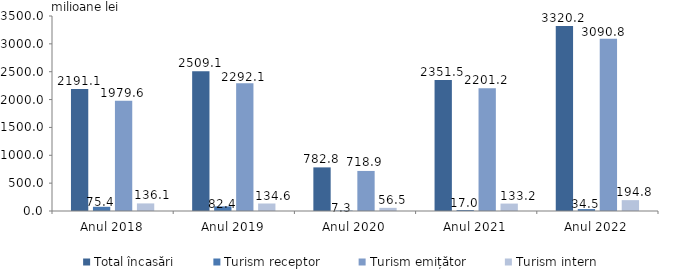
| Category | Total încasări | Turism receptor | Turism emițător | Turism intern |
|---|---|---|---|---|
| Anul 2018 | 2191.1 | 75.4 | 1979.6 | 136.1 |
| Anul 2019 | 2509.1 | 82.4 | 2292.1 | 134.6 |
| Anul 2020 | 782.8 | 7.32 | 718.93 | 56.52 |
| Anul 2021 | 2351.45 | 17.02 | 2201.22 | 133.22 |
| Anul 2022 | 3320.157 | 34.524 | 3090.807 | 194.826 |